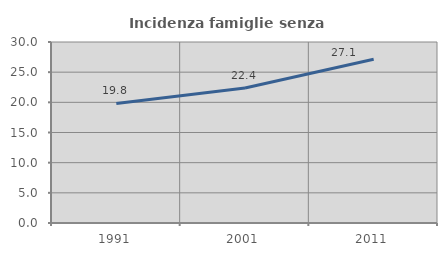
| Category | Incidenza famiglie senza nuclei |
|---|---|
| 1991.0 | 19.823 |
| 2001.0 | 22.37 |
| 2011.0 | 27.129 |